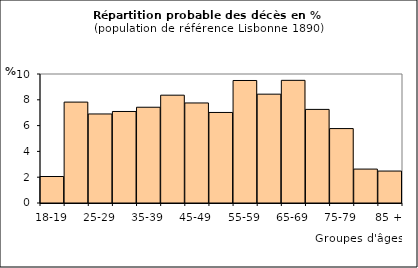
| Category | Series 0 |
|---|---|
| 18-19 | 2.054 |
| 20-24 | 7.821 |
| 25-29 | 6.902 |
| 30-34 | 7.095 |
| 35-39 | 7.423 |
| 40-44 | 8.358 |
| 45-49 | 7.754 |
| 50-54 | 7.019 |
| 55-59 | 9.496 |
| 60-64 | 8.437 |
| 65-69 | 9.509 |
| 70-74 | 7.256 |
| 75-79 | 5.77 |
| 80-84 | 2.629 |
| 85 + | 2.477 |